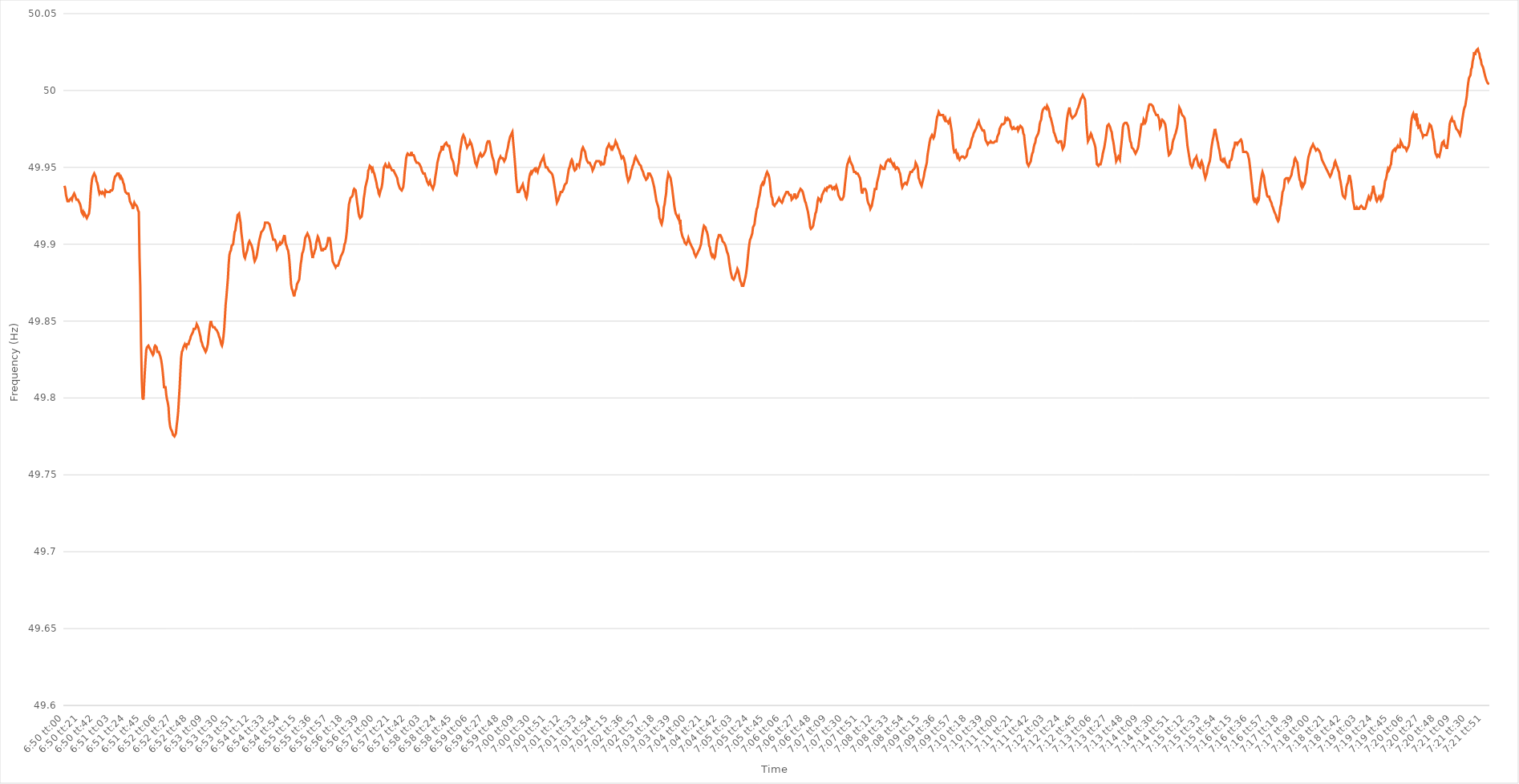
| Category | Series 0 |
|---|---|
| 0.2847222222222222 | 49.938 |
| 0.2847337962962963 | 49.936 |
| 0.28474537037037034 | 49.932 |
| 0.28475694444444444 | 49.93 |
| 0.28476851851851853 | 49.928 |
| 0.28478009259259257 | 49.928 |
| 0.28479166666666667 | 49.928 |
| 0.28480324074074076 | 49.929 |
| 0.2848148148148148 | 49.929 |
| 0.2848263888888889 | 49.93 |
| 0.284837962962963 | 49.929 |
| 0.284849537037037 | 49.931 |
| 0.2848611111111111 | 49.932 |
| 0.2848726851851852 | 49.933 |
| 0.28488425925925925 | 49.932 |
| 0.28489583333333335 | 49.932 |
| 0.2849074074074074 | 49.929 |
| 0.2849189814814815 | 49.929 |
| 0.2849305555555555 | 49.929 |
| 0.28494212962962967 | 49.929 |
| 0.2849537037037037 | 49.927 |
| 0.28496527777777775 | 49.926 |
| 0.28497685185185184 | 49.924 |
| 0.28498842592592594 | 49.921 |
| 0.285 | 49.92 |
| 0.28501157407407407 | 49.921 |
| 0.28502314814814816 | 49.919 |
| 0.2850347222222222 | 49.92 |
| 0.2850462962962963 | 49.919 |
| 0.2850578703703704 | 49.919 |
| 0.28506944444444443 | 49.917 |
| 0.2850810185185185 | 49.918 |
| 0.2850925925925926 | 49.918 |
| 0.28510416666666666 | 49.92 |
| 0.28511574074074075 | 49.924 |
| 0.28512731481481485 | 49.932 |
| 0.2851388888888889 | 49.938 |
| 0.2851504629629629 | 49.942 |
| 0.2851620370370371 | 49.944 |
| 0.2851736111111111 | 49.945 |
| 0.28518518518518515 | 49.946 |
| 0.28519675925925925 | 49.946 |
| 0.28520833333333334 | 49.944 |
| 0.2852199074074074 | 49.941 |
| 0.2852314814814815 | 49.94 |
| 0.28524305555555557 | 49.938 |
| 0.2852546296296296 | 49.935 |
| 0.2852662037037037 | 49.933 |
| 0.2852777777777778 | 49.934 |
| 0.28528935185185184 | 49.934 |
| 0.28530092592592593 | 49.933 |
| 0.2853125 | 49.934 |
| 0.28532407407407406 | 49.934 |
| 0.28533564814814816 | 49.933 |
| 0.28534722222222225 | 49.932 |
| 0.2853587962962963 | 49.935 |
| 0.28537037037037033 | 49.935 |
| 0.2853819444444445 | 49.934 |
| 0.2853935185185185 | 49.934 |
| 0.2854050925925926 | 49.934 |
| 0.28541666666666665 | 49.934 |
| 0.28542824074074075 | 49.934 |
| 0.2854398148148148 | 49.935 |
| 0.2854513888888889 | 49.935 |
| 0.285462962962963 | 49.935 |
| 0.285474537037037 | 49.936 |
| 0.2854861111111111 | 49.94 |
| 0.2854976851851852 | 49.942 |
| 0.28550925925925924 | 49.944 |
| 0.28552083333333333 | 49.944 |
| 0.28553240740740743 | 49.945 |
| 0.28554398148148147 | 49.946 |
| 0.28555555555555556 | 49.946 |
| 0.28556712962962966 | 49.946 |
| 0.2855787037037037 | 49.944 |
| 0.2855902777777778 | 49.943 |
| 0.2856018518518519 | 49.944 |
| 0.2856134259259259 | 49.943 |
| 0.285625 | 49.942 |
| 0.28563657407407406 | 49.94 |
| 0.28564814814814815 | 49.939 |
| 0.2856597222222222 | 49.936 |
| 0.2856712962962963 | 49.934 |
| 0.2856828703703704 | 49.934 |
| 0.2856944444444444 | 49.933 |
| 0.2857060185185185 | 49.933 |
| 0.2857175925925926 | 49.933 |
| 0.28572916666666665 | 49.931 |
| 0.28574074074074074 | 49.928 |
| 0.28575231481481483 | 49.928 |
| 0.2857638888888889 | 49.926 |
| 0.28577546296296297 | 49.925 |
| 0.28578703703703706 | 49.923 |
| 0.2857986111111111 | 49.925 |
| 0.2858101851851852 | 49.927 |
| 0.2858217592592593 | 49.926 |
| 0.28583333333333333 | 49.926 |
| 0.2858449074074074 | 49.925 |
| 0.28585648148148146 | 49.924 |
| 0.28586805555555556 | 49.922 |
| 0.2858796296296296 | 49.921 |
| 0.2858912037037037 | 49.891 |
| 0.2859027777777778 | 49.873 |
| 0.2859143518518518 | 49.837 |
| 0.2859259259259259 | 49.812 |
| 0.2859375 | 49.8 |
| 0.28594907407407405 | 49.799 |
| 0.28596064814814814 | 49.807 |
| 0.28597222222222224 | 49.816 |
| 0.2859837962962963 | 49.824 |
| 0.28599537037037037 | 49.831 |
| 0.28600694444444447 | 49.833 |
| 0.2860185185185185 | 49.833 |
| 0.2860300925925926 | 49.834 |
| 0.2860416666666667 | 49.833 |
| 0.28605324074074073 | 49.832 |
| 0.2860648148148148 | 49.831 |
| 0.2860763888888889 | 49.83 |
| 0.28608796296296296 | 49.829 |
| 0.286099537037037 | 49.828 |
| 0.28611111111111115 | 49.829 |
| 0.2861226851851852 | 49.833 |
| 0.2861342592592592 | 49.834 |
| 0.2861458333333333 | 49.834 |
| 0.2861574074074074 | 49.833 |
| 0.28616898148148145 | 49.83 |
| 0.28618055555555555 | 49.83 |
| 0.28619212962962964 | 49.83 |
| 0.2862037037037037 | 49.83 |
| 0.2862152777777778 | 49.827 |
| 0.28622685185185187 | 49.825 |
| 0.2862384259259259 | 49.822 |
| 0.28625 | 49.818 |
| 0.2862615740740741 | 49.813 |
| 0.28627314814814814 | 49.807 |
| 0.28628472222222223 | 49.807 |
| 0.2862962962962963 | 49.807 |
| 0.28630787037037037 | 49.802 |
| 0.2863194444444444 | 49.799 |
| 0.28633101851851855 | 49.797 |
| 0.2863425925925926 | 49.794 |
| 0.2863541666666667 | 49.786 |
| 0.2863657407407407 | 49.782 |
| 0.2863773148148148 | 49.78 |
| 0.28638888888888886 | 49.779 |
| 0.28640046296296295 | 49.778 |
| 0.28641203703703705 | 49.776 |
| 0.2864236111111111 | 49.776 |
| 0.2864351851851852 | 49.775 |
| 0.2864467592592593 | 49.776 |
| 0.2864583333333333 | 49.777 |
| 0.2864699074074074 | 49.782 |
| 0.2864814814814815 | 49.786 |
| 0.28649305555555554 | 49.791 |
| 0.28650462962962964 | 49.799 |
| 0.28651620370370373 | 49.807 |
| 0.28652777777777777 | 49.817 |
| 0.28653935185185186 | 49.826 |
| 0.28655092592592596 | 49.83 |
| 0.2865625 | 49.831 |
| 0.2865740740740741 | 49.833 |
| 0.28658564814814813 | 49.834 |
| 0.2865972222222222 | 49.835 |
| 0.28660879629629626 | 49.834 |
| 0.28662037037037036 | 49.833 |
| 0.28663194444444445 | 49.835 |
| 0.2866435185185185 | 49.835 |
| 0.2866550925925926 | 49.835 |
| 0.2866666666666667 | 49.837 |
| 0.2866782407407407 | 49.838 |
| 0.2866898148148148 | 49.84 |
| 0.2867013888888889 | 49.841 |
| 0.28671296296296295 | 49.842 |
| 0.28672453703703704 | 49.843 |
| 0.28673611111111114 | 49.845 |
| 0.2867476851851852 | 49.845 |
| 0.28675925925925927 | 49.845 |
| 0.28677083333333336 | 49.846 |
| 0.2867824074074074 | 49.848 |
| 0.2867939814814815 | 49.848 |
| 0.28680555555555554 | 49.846 |
| 0.28681712962962963 | 49.844 |
| 0.28682870370370367 | 49.844 |
| 0.28684027777777776 | 49.84 |
| 0.28685185185185186 | 49.837 |
| 0.2868634259259259 | 49.836 |
| 0.286875 | 49.834 |
| 0.2868865740740741 | 49.834 |
| 0.2868981481481481 | 49.832 |
| 0.2869097222222222 | 49.831 |
| 0.2869212962962963 | 49.83 |
| 0.28693287037037035 | 49.831 |
| 0.28694444444444445 | 49.833 |
| 0.28695601851851854 | 49.835 |
| 0.2869675925925926 | 49.84 |
| 0.2869791666666667 | 49.844 |
| 0.28699074074074077 | 49.848 |
| 0.2870023148148148 | 49.85 |
| 0.2870138888888889 | 49.848 |
| 0.287025462962963 | 49.847 |
| 0.28703703703703703 | 49.846 |
| 0.2870486111111111 | 49.846 |
| 0.2870601851851852 | 49.846 |
| 0.28707175925925926 | 49.845 |
| 0.2870833333333333 | 49.845 |
| 0.2870949074074074 | 49.844 |
| 0.2871064814814815 | 49.843 |
| 0.28711805555555553 | 49.842 |
| 0.2871296296296296 | 49.84 |
| 0.2871412037037037 | 49.839 |
| 0.28715277777777776 | 49.837 |
| 0.28716435185185185 | 49.835 |
| 0.28717592592592595 | 49.834 |
| 0.2871875 | 49.836 |
| 0.2871990740740741 | 49.84 |
| 0.2872106481481482 | 49.845 |
| 0.2872222222222222 | 49.853 |
| 0.2872337962962963 | 49.861 |
| 0.2872453703703704 | 49.866 |
| 0.28725694444444444 | 49.872 |
| 0.2872685185185185 | 49.878 |
| 0.28728009259259263 | 49.887 |
| 0.28729166666666667 | 49.893 |
| 0.28730324074074076 | 49.895 |
| 0.2873148148148148 | 49.896 |
| 0.2873263888888889 | 49.899 |
| 0.28733796296296293 | 49.899 |
| 0.28734953703703703 | 49.9 |
| 0.2873611111111111 | 49.904 |
| 0.28737268518518516 | 49.908 |
| 0.28738425925925926 | 49.909 |
| 0.28739583333333335 | 49.913 |
| 0.2874074074074074 | 49.915 |
| 0.2874189814814815 | 49.919 |
| 0.2874305555555556 | 49.919 |
| 0.2874421296296296 | 49.92 |
| 0.2874537037037037 | 49.917 |
| 0.2874652777777778 | 49.914 |
| 0.28747685185185184 | 49.908 |
| 0.28748842592592594 | 49.904 |
| 0.28750000000000003 | 49.9 |
| 0.28751157407407407 | 49.895 |
| 0.28752314814814817 | 49.892 |
| 0.2875347222222222 | 49.891 |
| 0.2875462962962963 | 49.893 |
| 0.28755787037037034 | 49.893 |
| 0.28756944444444443 | 49.896 |
| 0.2875810185185185 | 49.899 |
| 0.28759259259259257 | 49.901 |
| 0.28760416666666666 | 49.902 |
| 0.28761574074074076 | 49.902 |
| 0.2876273148148148 | 49.9 |
| 0.2876388888888889 | 49.899 |
| 0.287650462962963 | 49.897 |
| 0.287662037037037 | 49.895 |
| 0.2876736111111111 | 49.891 |
| 0.2876851851851852 | 49.889 |
| 0.28769675925925925 | 49.889 |
| 0.28770833333333334 | 49.891 |
| 0.28771990740740744 | 49.893 |
| 0.2877314814814815 | 49.896 |
| 0.28774305555555557 | 49.899 |
| 0.2877546296296296 | 49.902 |
| 0.2877662037037037 | 49.904 |
| 0.28777777777777774 | 49.906 |
| 0.28778935185185184 | 49.908 |
| 0.28780092592592593 | 49.908 |
| 0.28781249999999997 | 49.909 |
| 0.28782407407407407 | 49.91 |
| 0.28783564814814816 | 49.911 |
| 0.2878472222222222 | 49.914 |
| 0.2878587962962963 | 49.914 |
| 0.2878703703703704 | 49.914 |
| 0.2878819444444444 | 49.914 |
| 0.2878935185185185 | 49.914 |
| 0.2879050925925926 | 49.914 |
| 0.28791666666666665 | 49.913 |
| 0.28792824074074075 | 49.911 |
| 0.28793981481481484 | 49.909 |
| 0.2879513888888889 | 49.907 |
| 0.287962962962963 | 49.905 |
| 0.287974537037037 | 49.903 |
| 0.2879861111111111 | 49.903 |
| 0.28799768518518515 | 49.903 |
| 0.2880092592592593 | 49.902 |
| 0.28802083333333334 | 49.9 |
| 0.2880324074074074 | 49.897 |
| 0.28804398148148147 | 49.897 |
| 0.28805555555555556 | 49.899 |
| 0.2880671296296296 | 49.9 |
| 0.2880787037037037 | 49.901 |
| 0.2880902777777778 | 49.9 |
| 0.28810185185185183 | 49.9 |
| 0.2881134259259259 | 49.901 |
| 0.288125 | 49.903 |
| 0.28813657407407406 | 49.903 |
| 0.28814814814814815 | 49.906 |
| 0.28815972222222225 | 49.903 |
| 0.2881712962962963 | 49.9 |
| 0.2881828703703704 | 49.899 |
| 0.2881944444444445 | 49.897 |
| 0.2882060185185185 | 49.896 |
| 0.28821759259259255 | 49.893 |
| 0.2882291666666667 | 49.888 |
| 0.28824074074074074 | 49.881 |
| 0.28825231481481484 | 49.874 |
| 0.2882638888888889 | 49.871 |
| 0.28827546296296297 | 49.87 |
| 0.288287037037037 | 49.868 |
| 0.2882986111111111 | 49.866 |
| 0.2883101851851852 | 49.868 |
| 0.28832175925925924 | 49.87 |
| 0.28833333333333333 | 49.871 |
| 0.2883449074074074 | 49.874 |
| 0.28835648148148146 | 49.875 |
| 0.28836805555555556 | 49.875 |
| 0.28837962962962965 | 49.877 |
| 0.2883912037037037 | 49.882 |
| 0.2884027777777778 | 49.887 |
| 0.2884143518518519 | 49.89 |
| 0.2884259259259259 | 49.894 |
| 0.2884375 | 49.895 |
| 0.2884490740740741 | 49.897 |
| 0.28846064814814815 | 49.9 |
| 0.28847222222222224 | 49.904 |
| 0.2884837962962963 | 49.905 |
| 0.2884953703703704 | 49.906 |
| 0.2885069444444444 | 49.907 |
| 0.2885185185185185 | 49.906 |
| 0.2885300925925926 | 49.905 |
| 0.28854166666666664 | 49.903 |
| 0.28855324074074074 | 49.901 |
| 0.28856481481481483 | 49.897 |
| 0.28857638888888887 | 49.894 |
| 0.28858796296296296 | 49.891 |
| 0.28859953703703706 | 49.893 |
| 0.2886111111111111 | 49.894 |
| 0.2886226851851852 | 49.896 |
| 0.2886342592592593 | 49.897 |
| 0.2886458333333333 | 49.901 |
| 0.2886574074074074 | 49.903 |
| 0.2886689814814815 | 49.905 |
| 0.28868055555555555 | 49.904 |
| 0.28869212962962965 | 49.902 |
| 0.2887037037037037 | 49.9 |
| 0.2887152777777778 | 49.898 |
| 0.2887268518518518 | 49.896 |
| 0.2887384259259259 | 49.896 |
| 0.28875 | 49.896 |
| 0.28876157407407405 | 49.897 |
| 0.28877314814814814 | 49.897 |
| 0.28878472222222223 | 49.897 |
| 0.2887962962962963 | 49.897 |
| 0.28880787037037037 | 49.899 |
| 0.28881944444444446 | 49.901 |
| 0.2888310185185185 | 49.904 |
| 0.2888425925925926 | 49.904 |
| 0.2888541666666667 | 49.904 |
| 0.28886574074074073 | 49.902 |
| 0.2888773148148148 | 49.897 |
| 0.2888888888888889 | 49.894 |
| 0.28890046296296296 | 49.889 |
| 0.28891203703703705 | 49.888 |
| 0.2889236111111111 | 49.888 |
| 0.2889351851851852 | 49.886 |
| 0.2889467592592592 | 49.885 |
| 0.2889583333333334 | 49.886 |
| 0.2889699074074074 | 49.886 |
| 0.28898148148148145 | 49.886 |
| 0.28899305555555554 | 49.887 |
| 0.28900462962962964 | 49.889 |
| 0.2890162037037037 | 49.89 |
| 0.2890277777777778 | 49.892 |
| 0.28903935185185187 | 49.893 |
| 0.2890509259259259 | 49.893 |
| 0.2890625 | 49.895 |
| 0.2890740740740741 | 49.897 |
| 0.28908564814814813 | 49.9 |
| 0.2890972222222222 | 49.901 |
| 0.2891087962962963 | 49.904 |
| 0.28912037037037036 | 49.908 |
| 0.28913194444444446 | 49.914 |
| 0.28914351851851855 | 49.921 |
| 0.2891550925925926 | 49.926 |
| 0.2891666666666666 | 49.926 |
| 0.2891782407407408 | 49.93 |
| 0.2891898148148148 | 49.93 |
| 0.2892013888888889 | 49.931 |
| 0.28921296296296295 | 49.932 |
| 0.28922453703703704 | 49.935 |
| 0.2892361111111111 | 49.936 |
| 0.2892476851851852 | 49.936 |
| 0.28925925925925927 | 49.935 |
| 0.2892708333333333 | 49.931 |
| 0.2892824074074074 | 49.927 |
| 0.2892939814814815 | 49.924 |
| 0.28930555555555554 | 49.92 |
| 0.28931712962962963 | 49.918 |
| 0.2893287037037037 | 49.917 |
| 0.28934027777777777 | 49.917 |
| 0.28935185185185186 | 49.918 |
| 0.28936342592592595 | 49.921 |
| 0.289375 | 49.925 |
| 0.2893865740740741 | 49.93 |
| 0.2893981481481482 | 49.933 |
| 0.2894097222222222 | 49.937 |
| 0.2894212962962963 | 49.939 |
| 0.28943287037037035 | 49.941 |
| 0.28944444444444445 | 49.943 |
| 0.2894560185185185 | 49.948 |
| 0.2894675925925926 | 49.949 |
| 0.2894791666666667 | 49.951 |
| 0.2894907407407407 | 49.951 |
| 0.2895023148148148 | 49.95 |
| 0.2895138888888889 | 49.948 |
| 0.28952546296296294 | 49.949 |
| 0.28953703703703704 | 49.947 |
| 0.28954861111111113 | 49.946 |
| 0.28956018518518517 | 49.944 |
| 0.28957175925925926 | 49.942 |
| 0.28958333333333336 | 49.94 |
| 0.2895949074074074 | 49.937 |
| 0.2896064814814815 | 49.936 |
| 0.2896180555555556 | 49.933 |
| 0.2896296296296296 | 49.932 |
| 0.2896412037037037 | 49.934 |
| 0.28965277777777776 | 49.934 |
| 0.28966435185185185 | 49.937 |
| 0.2896759259259259 | 49.94 |
| 0.2896875 | 49.945 |
| 0.2896990740740741 | 49.95 |
| 0.2897106481481481 | 49.951 |
| 0.2897222222222222 | 49.952 |
| 0.2897337962962963 | 49.952 |
| 0.28974537037037035 | 49.95 |
| 0.28975694444444444 | 49.95 |
| 0.28976851851851854 | 49.95 |
| 0.2897800925925926 | 49.952 |
| 0.28979166666666667 | 49.952 |
| 0.28980324074074076 | 49.95 |
| 0.2898148148148148 | 49.95 |
| 0.2898263888888889 | 49.948 |
| 0.289837962962963 | 49.948 |
| 0.28984953703703703 | 49.948 |
| 0.2898611111111111 | 49.947 |
| 0.28987268518518516 | 49.947 |
| 0.28988425925925926 | 49.945 |
| 0.2898958333333333 | 49.944 |
| 0.28990740740740745 | 49.943 |
| 0.2899189814814815 | 49.94 |
| 0.2899305555555555 | 49.94 |
| 0.2899421296296296 | 49.937 |
| 0.2899537037037037 | 49.936 |
| 0.28996527777777775 | 49.936 |
| 0.28997685185185185 | 49.935 |
| 0.28998842592592594 | 49.936 |
| 0.29 | 49.937 |
| 0.2900115740740741 | 49.941 |
| 0.29002314814814817 | 49.947 |
| 0.2900347222222222 | 49.951 |
| 0.2900462962962963 | 49.956 |
| 0.2900578703703704 | 49.958 |
| 0.29006944444444444 | 49.959 |
| 0.29008101851851853 | 49.959 |
| 0.2900925925925926 | 49.958 |
| 0.29010416666666666 | 49.958 |
| 0.2901157407407407 | 49.958 |
| 0.29012731481481485 | 49.96 |
| 0.2901388888888889 | 49.958 |
| 0.290150462962963 | 49.958 |
| 0.290162037037037 | 49.958 |
| 0.2901736111111111 | 49.957 |
| 0.29018518518518516 | 49.955 |
| 0.29019675925925925 | 49.954 |
| 0.29020833333333335 | 49.953 |
| 0.2902199074074074 | 49.953 |
| 0.2902314814814815 | 49.953 |
| 0.2902430555555556 | 49.953 |
| 0.2902546296296296 | 49.952 |
| 0.2902662037037037 | 49.951 |
| 0.2902777777777778 | 49.95 |
| 0.29028935185185184 | 49.948 |
| 0.29030092592592593 | 49.947 |
| 0.29031250000000003 | 49.946 |
| 0.29032407407407407 | 49.946 |
| 0.29033564814814816 | 49.946 |
| 0.29034722222222226 | 49.944 |
| 0.2903587962962963 | 49.943 |
| 0.2903703703703704 | 49.941 |
| 0.29038194444444443 | 49.94 |
| 0.2903935185185185 | 49.939 |
| 0.29040509259259256 | 49.939 |
| 0.29041666666666666 | 49.941 |
| 0.29042824074074075 | 49.939 |
| 0.2904398148148148 | 49.938 |
| 0.2904513888888889 | 49.938 |
| 0.290462962962963 | 49.936 |
| 0.290474537037037 | 49.936 |
| 0.2904861111111111 | 49.939 |
| 0.2904976851851852 | 49.943 |
| 0.29050925925925924 | 49.946 |
| 0.29052083333333334 | 49.949 |
| 0.29053240740740743 | 49.953 |
| 0.2905439814814815 | 49.955 |
| 0.29055555555555557 | 49.957 |
| 0.29056712962962966 | 49.959 |
| 0.2905787037037037 | 49.96 |
| 0.2905902777777778 | 49.961 |
| 0.29060185185185183 | 49.964 |
| 0.29061342592592593 | 49.961 |
| 0.29062499999999997 | 49.963 |
| 0.29063657407407406 | 49.963 |
| 0.29064814814814816 | 49.965 |
| 0.2906597222222222 | 49.965 |
| 0.2906712962962963 | 49.966 |
| 0.2906828703703704 | 49.966 |
| 0.2906944444444444 | 49.964 |
| 0.2907060185185185 | 49.964 |
| 0.2907175925925926 | 49.964 |
| 0.29072916666666665 | 49.961 |
| 0.29074074074074074 | 49.959 |
| 0.29075231481481484 | 49.956 |
| 0.2907638888888889 | 49.955 |
| 0.29077546296296297 | 49.954 |
| 0.29078703703703707 | 49.952 |
| 0.2907986111111111 | 49.948 |
| 0.2908101851851852 | 49.946 |
| 0.29082175925925924 | 49.946 |
| 0.29083333333333333 | 49.945 |
| 0.29084490740740737 | 49.947 |
| 0.2908564814814815 | 49.951 |
| 0.29086805555555556 | 49.953 |
| 0.2908796296296296 | 49.959 |
| 0.2908912037037037 | 49.962 |
| 0.2909027777777778 | 49.965 |
| 0.2909143518518518 | 49.968 |
| 0.2909259259259259 | 49.97 |
| 0.2909375 | 49.971 |
| 0.29094907407407405 | 49.971 |
| 0.29096064814814815 | 49.969 |
| 0.29097222222222224 | 49.966 |
| 0.2909837962962963 | 49.965 |
| 0.2909953703703704 | 49.963 |
| 0.29100694444444447 | 49.964 |
| 0.2910185185185185 | 49.964 |
| 0.2910300925925926 | 49.965 |
| 0.2910416666666667 | 49.967 |
| 0.29105324074074074 | 49.967 |
| 0.2910648148148148 | 49.965 |
| 0.2910763888888889 | 49.963 |
| 0.29108796296296297 | 49.961 |
| 0.291099537037037 | 49.958 |
| 0.2911111111111111 | 49.956 |
| 0.2911226851851852 | 49.953 |
| 0.29113425925925923 | 49.952 |
| 0.2911458333333333 | 49.951 |
| 0.2911574074074074 | 49.953 |
| 0.29116898148148146 | 49.955 |
| 0.29118055555555555 | 49.957 |
| 0.29119212962962965 | 49.957 |
| 0.2912037037037037 | 49.959 |
| 0.2912152777777778 | 49.958 |
| 0.2912268518518519 | 49.957 |
| 0.2912384259259259 | 49.957 |
| 0.29125 | 49.958 |
| 0.2912615740740741 | 49.958 |
| 0.29127314814814814 | 49.96 |
| 0.29128472222222224 | 49.961 |
| 0.29129629629629633 | 49.964 |
| 0.29130787037037037 | 49.966 |
| 0.29131944444444446 | 49.967 |
| 0.2913310185185185 | 49.967 |
| 0.2913425925925926 | 49.967 |
| 0.29135416666666664 | 49.965 |
| 0.29136574074074073 | 49.962 |
| 0.2913773148148148 | 49.959 |
| 0.29138888888888886 | 49.957 |
| 0.29140046296296296 | 49.957 |
| 0.29141203703703705 | 49.954 |
| 0.2914236111111111 | 49.95 |
| 0.2914351851851852 | 49.947 |
| 0.2914467592592593 | 49.946 |
| 0.2914583333333333 | 49.947 |
| 0.2914699074074074 | 49.95 |
| 0.2914814814814815 | 49.953 |
| 0.29149305555555555 | 49.955 |
| 0.29150462962962964 | 49.956 |
| 0.29151620370370374 | 49.957 |
| 0.2915277777777778 | 49.956 |
| 0.29153935185185187 | 49.956 |
| 0.2915509259259259 | 49.956 |
| 0.2915625 | 49.955 |
| 0.29157407407407404 | 49.954 |
| 0.29158564814814814 | 49.954 |
| 0.29159722222222223 | 49.956 |
| 0.29160879629629627 | 49.959 |
| 0.29162037037037036 | 49.961 |
| 0.29163194444444446 | 49.963 |
| 0.2916435185185185 | 49.966 |
| 0.2916550925925926 | 49.968 |
| 0.2916666666666667 | 49.97 |
| 0.2916782407407407 | 49.971 |
| 0.2916898148148148 | 49.972 |
| 0.2917013888888889 | 49.973 |
| 0.29171296296296295 | 49.967 |
| 0.29172453703703705 | 49.962 |
| 0.29173611111111114 | 49.956 |
| 0.2917476851851852 | 49.95 |
| 0.2917592592592593 | 49.943 |
| 0.29177083333333337 | 49.938 |
| 0.2917824074074074 | 49.934 |
| 0.29179398148148145 | 49.934 |
| 0.29180555555555554 | 49.934 |
| 0.29181712962962963 | 49.934 |
| 0.2918287037037037 | 49.936 |
| 0.29184027777777777 | 49.937 |
| 0.29185185185185186 | 49.938 |
| 0.2918634259259259 | 49.939 |
| 0.291875 | 49.937 |
| 0.2918865740740741 | 49.935 |
| 0.29189814814814813 | 49.934 |
| 0.2919097222222222 | 49.931 |
| 0.2919212962962963 | 49.93 |
| 0.29193287037037036 | 49.932 |
| 0.29194444444444445 | 49.936 |
| 0.29195601851851855 | 49.941 |
| 0.2919675925925926 | 49.944 |
| 0.2919791666666667 | 49.946 |
| 0.2919907407407408 | 49.947 |
| 0.2920023148148148 | 49.946 |
| 0.2920138888888889 | 49.946 |
| 0.29202546296296295 | 49.948 |
| 0.29203703703703704 | 49.948 |
| 0.2920486111111111 | 49.949 |
| 0.2920601851851852 | 49.948 |
| 0.29207175925925927 | 49.949 |
| 0.2920833333333333 | 49.948 |
| 0.2920949074074074 | 49.947 |
| 0.2921064814814815 | 49.949 |
| 0.29211805555555553 | 49.95 |
| 0.29212962962962963 | 49.951 |
| 0.2921412037037037 | 49.953 |
| 0.29215277777777776 | 49.953 |
| 0.29216435185185186 | 49.955 |
| 0.29217592592592595 | 49.955 |
| 0.2921875 | 49.957 |
| 0.2921990740740741 | 49.954 |
| 0.2922106481481482 | 49.952 |
| 0.2922222222222222 | 49.95 |
| 0.2922337962962963 | 49.95 |
| 0.2922453703703704 | 49.95 |
| 0.29225694444444444 | 49.95 |
| 0.2922685185185185 | 49.948 |
| 0.2922800925925926 | 49.948 |
| 0.29229166666666667 | 49.947 |
| 0.2923032407407407 | 49.947 |
| 0.2923148148148148 | 49.946 |
| 0.2923263888888889 | 49.945 |
| 0.29233796296296294 | 49.943 |
| 0.29234953703703703 | 49.94 |
| 0.2923611111111111 | 49.937 |
| 0.29237268518518517 | 49.934 |
| 0.29238425925925926 | 49.93 |
| 0.29239583333333335 | 49.927 |
| 0.2924074074074074 | 49.927 |
| 0.2924189814814815 | 49.929 |
| 0.2924305555555556 | 49.931 |
| 0.2924421296296296 | 49.932 |
| 0.2924537037037037 | 49.934 |
| 0.2924652777777778 | 49.934 |
| 0.29247685185185185 | 49.934 |
| 0.29248842592592594 | 49.935 |
| 0.2925 | 49.936 |
| 0.2925115740740741 | 49.938 |
| 0.2925231481481481 | 49.939 |
| 0.2925347222222222 | 49.939 |
| 0.2925462962962963 | 49.94 |
| 0.29255787037037034 | 49.943 |
| 0.29256944444444444 | 49.946 |
| 0.29258101851851853 | 49.949 |
| 0.29259259259259257 | 49.95 |
| 0.29260416666666667 | 49.952 |
| 0.29261574074074076 | 49.954 |
| 0.2926273148148148 | 49.955 |
| 0.2926388888888889 | 49.954 |
| 0.292650462962963 | 49.951 |
| 0.292662037037037 | 49.949 |
| 0.2926736111111111 | 49.948 |
| 0.2926851851851852 | 49.948 |
| 0.29269675925925925 | 49.949 |
| 0.29270833333333335 | 49.952 |
| 0.29271990740740744 | 49.952 |
| 0.2927314814814815 | 49.952 |
| 0.2927430555555555 | 49.951 |
| 0.2927546296296296 | 49.954 |
| 0.2927662037037037 | 49.956 |
| 0.29277777777777775 | 49.96 |
| 0.29278935185185184 | 49.962 |
| 0.29280092592592594 | 49.963 |
| 0.2928125 | 49.963 |
| 0.29282407407407407 | 49.961 |
| 0.29283564814814816 | 49.96 |
| 0.2928472222222222 | 49.957 |
| 0.2928587962962963 | 49.955 |
| 0.2928703703703704 | 49.954 |
| 0.29288194444444443 | 49.953 |
| 0.2928935185185185 | 49.953 |
| 0.2929050925925926 | 49.953 |
| 0.29291666666666666 | 49.953 |
| 0.29292824074074075 | 49.951 |
| 0.29293981481481485 | 49.95 |
| 0.2929513888888889 | 49.948 |
| 0.292962962962963 | 49.948 |
| 0.292974537037037 | 49.95 |
| 0.2929861111111111 | 49.952 |
| 0.29299768518518515 | 49.953 |
| 0.29300925925925925 | 49.954 |
| 0.29302083333333334 | 49.954 |
| 0.2930324074074074 | 49.954 |
| 0.2930439814814815 | 49.954 |
| 0.29305555555555557 | 49.954 |
| 0.2930671296296296 | 49.953 |
| 0.2930787037037037 | 49.952 |
| 0.2930902777777778 | 49.953 |
| 0.29310185185185184 | 49.952 |
| 0.29311342592592593 | 49.952 |
| 0.293125 | 49.952 |
| 0.29313657407407406 | 49.953 |
| 0.29314814814814816 | 49.957 |
| 0.29315972222222225 | 49.958 |
| 0.2931712962962963 | 49.962 |
| 0.2931828703703704 | 49.963 |
| 0.2931944444444445 | 49.964 |
| 0.2932060185185185 | 49.965 |
| 0.29321759259259256 | 49.965 |
| 0.29322916666666665 | 49.963 |
| 0.29324074074074075 | 49.962 |
| 0.2932523148148148 | 49.963 |
| 0.2932638888888889 | 49.962 |
| 0.293275462962963 | 49.962 |
| 0.293287037037037 | 49.964 |
| 0.2932986111111111 | 49.965 |
| 0.2933101851851852 | 49.967 |
| 0.29332175925925924 | 49.966 |
| 0.29333333333333333 | 49.965 |
| 0.29334490740740743 | 49.963 |
| 0.29335648148148147 | 49.962 |
| 0.29336805555555556 | 49.961 |
| 0.29337962962962966 | 49.959 |
| 0.2933912037037037 | 49.958 |
| 0.2934027777777778 | 49.956 |
| 0.2934143518518519 | 49.956 |
| 0.2934259259259259 | 49.957 |
| 0.2934375 | 49.956 |
| 0.29344907407407406 | 49.954 |
| 0.29346064814814815 | 49.952 |
| 0.2934722222222222 | 49.948 |
| 0.2934837962962963 | 49.945 |
| 0.2934953703703704 | 49.943 |
| 0.2935069444444444 | 49.941 |
| 0.2935185185185185 | 49.942 |
| 0.2935300925925926 | 49.943 |
| 0.29354166666666665 | 49.945 |
| 0.29355324074074074 | 49.948 |
| 0.29356481481481483 | 49.949 |
| 0.2935763888888889 | 49.951 |
| 0.29358796296296297 | 49.952 |
| 0.29359953703703706 | 49.954 |
| 0.2936111111111111 | 49.956 |
| 0.2936226851851852 | 49.957 |
| 0.2936342592592593 | 49.957 |
| 0.29364583333333333 | 49.955 |
| 0.2936574074074074 | 49.954 |
| 0.2936689814814815 | 49.953 |
| 0.29368055555555556 | 49.952 |
| 0.2936921296296296 | 49.952 |
| 0.2937037037037037 | 49.951 |
| 0.2937152777777778 | 49.949 |
| 0.2937268518518518 | 49.948 |
| 0.2937384259259259 | 49.947 |
| 0.29375 | 49.945 |
| 0.29376157407407405 | 49.945 |
| 0.29377314814814814 | 49.943 |
| 0.29378472222222224 | 49.942 |
| 0.2937962962962963 | 49.942 |
| 0.29380787037037037 | 49.943 |
| 0.29381944444444447 | 49.946 |
| 0.2938310185185185 | 49.946 |
| 0.2938425925925926 | 49.946 |
| 0.2938541666666667 | 49.945 |
| 0.29386574074074073 | 49.945 |
| 0.2938773148148148 | 49.943 |
| 0.2938888888888889 | 49.941 |
| 0.29390046296296296 | 49.939 |
| 0.29391203703703705 | 49.937 |
| 0.2939236111111111 | 49.934 |
| 0.2939351851851852 | 49.931 |
| 0.2939467592592592 | 49.928 |
| 0.2939583333333333 | 49.928 |
| 0.2939699074074074 | 49.925 |
| 0.29398148148148145 | 49.923 |
| 0.29399305555555555 | 49.917 |
| 0.29400462962962964 | 49.916 |
| 0.2940162037037037 | 49.914 |
| 0.2940277777777778 | 49.913 |
| 0.29403935185185187 | 49.915 |
| 0.2940509259259259 | 49.918 |
| 0.2940625 | 49.924 |
| 0.2940740740740741 | 49.926 |
| 0.29408564814814814 | 49.93 |
| 0.29409722222222223 | 49.933 |
| 0.2941087962962963 | 49.94 |
| 0.29412037037037037 | 49.943 |
| 0.29413194444444446 | 49.946 |
| 0.29414351851851855 | 49.945 |
| 0.2941550925925926 | 49.945 |
| 0.29416666666666663 | 49.943 |
| 0.2941782407407407 | 49.94 |
| 0.2941898148148148 | 49.937 |
| 0.29420138888888886 | 49.933 |
| 0.29421296296296295 | 49.929 |
| 0.29422453703703705 | 49.925 |
| 0.2942361111111111 | 49.922 |
| 0.2942476851851852 | 49.92 |
| 0.2942592592592593 | 49.919 |
| 0.2942708333333333 | 49.919 |
| 0.2942824074074074 | 49.917 |
| 0.2942939814814815 | 49.918 |
| 0.29430555555555554 | 49.915 |
| 0.29431712962962964 | 49.916 |
| 0.29432870370370373 | 49.909 |
| 0.29434027777777777 | 49.907 |
| 0.29435185185185186 | 49.905 |
| 0.29436342592592596 | 49.904 |
| 0.294375 | 49.903 |
| 0.2943865740740741 | 49.901 |
| 0.29439814814814813 | 49.901 |
| 0.2944097222222222 | 49.9 |
| 0.29442129629629626 | 49.901 |
| 0.29443287037037036 | 49.902 |
| 0.29444444444444445 | 49.904 |
| 0.2944560185185185 | 49.904 |
| 0.2944675925925926 | 49.901 |
| 0.2944791666666667 | 49.9 |
| 0.2944907407407407 | 49.899 |
| 0.2945023148148148 | 49.898 |
| 0.2945138888888889 | 49.897 |
| 0.29452546296296295 | 49.896 |
| 0.29453703703703704 | 49.894 |
| 0.29454861111111114 | 49.893 |
| 0.2945601851851852 | 49.892 |
| 0.29457175925925927 | 49.893 |
| 0.29458333333333336 | 49.894 |
| 0.2945949074074074 | 49.895 |
| 0.2946064814814815 | 49.896 |
| 0.2946180555555556 | 49.897 |
| 0.29462962962962963 | 49.897 |
| 0.29464120370370367 | 49.9 |
| 0.29465277777777776 | 49.904 |
| 0.29466435185185186 | 49.907 |
| 0.2946759259259259 | 49.91 |
| 0.2946875 | 49.912 |
| 0.2946990740740741 | 49.912 |
| 0.2947106481481481 | 49.911 |
| 0.2947222222222222 | 49.909 |
| 0.2947337962962963 | 49.908 |
| 0.29474537037037035 | 49.906 |
| 0.29475694444444445 | 49.903 |
| 0.29476851851851854 | 49.899 |
| 0.2947800925925926 | 49.898 |
| 0.2947916666666667 | 49.895 |
| 0.29480324074074077 | 49.893 |
| 0.2948148148148148 | 49.892 |
| 0.2948263888888889 | 49.893 |
| 0.294837962962963 | 49.892 |
| 0.29484953703703703 | 49.891 |
| 0.2948611111111111 | 49.892 |
| 0.29487268518518517 | 49.896 |
| 0.29488425925925926 | 49.9 |
| 0.2948958333333333 | 49.903 |
| 0.2949074074074074 | 49.904 |
| 0.2949189814814815 | 49.906 |
| 0.29493055555555553 | 49.906 |
| 0.2949421296296296 | 49.906 |
| 0.2949537037037037 | 49.905 |
| 0.29496527777777776 | 49.904 |
| 0.29497685185185185 | 49.902 |
| 0.29498842592592595 | 49.902 |
| 0.295 | 49.901 |
| 0.2950115740740741 | 49.9 |
| 0.2950231481481482 | 49.899 |
| 0.2950347222222222 | 49.897 |
| 0.2950462962962963 | 49.895 |
| 0.2950578703703704 | 49.894 |
| 0.29506944444444444 | 49.892 |
| 0.29508101851851853 | 49.888 |
| 0.29509259259259263 | 49.885 |
| 0.29510416666666667 | 49.882 |
| 0.2951157407407407 | 49.88 |
| 0.2951273148148148 | 49.878 |
| 0.2951388888888889 | 49.878 |
| 0.29515046296296293 | 49.877 |
| 0.29516203703703703 | 49.878 |
| 0.2951736111111111 | 49.878 |
| 0.29518518518518516 | 49.881 |
| 0.29519675925925926 | 49.882 |
| 0.29520833333333335 | 49.884 |
| 0.2952199074074074 | 49.883 |
| 0.2952314814814815 | 49.881 |
| 0.2952430555555556 | 49.878 |
| 0.2952546296296296 | 49.876 |
| 0.2952662037037037 | 49.875 |
| 0.2952777777777778 | 49.873 |
| 0.29528935185185184 | 49.873 |
| 0.29530092592592594 | 49.873 |
| 0.29531250000000003 | 49.875 |
| 0.29532407407407407 | 49.877 |
| 0.29533564814814817 | 49.879 |
| 0.2953472222222222 | 49.882 |
| 0.2953587962962963 | 49.886 |
| 0.29537037037037034 | 49.891 |
| 0.29538194444444443 | 49.896 |
| 0.2953935185185185 | 49.9 |
| 0.29540509259259257 | 49.903 |
| 0.29541666666666666 | 49.904 |
| 0.29542824074074076 | 49.904 |
| 0.2954398148148148 | 49.907 |
| 0.2954513888888889 | 49.911 |
| 0.295462962962963 | 49.912 |
| 0.295474537037037 | 49.913 |
| 0.2954861111111111 | 49.917 |
| 0.2954976851851852 | 49.92 |
| 0.29550925925925925 | 49.923 |
| 0.29552083333333334 | 49.924 |
| 0.29553240740740744 | 49.927 |
| 0.2955439814814815 | 49.93 |
| 0.29555555555555557 | 49.932 |
| 0.29556712962962967 | 49.935 |
| 0.2955787037037037 | 49.938 |
| 0.29559027777777774 | 49.938 |
| 0.29560185185185184 | 49.94 |
| 0.29561342592592593 | 49.939 |
| 0.29562499999999997 | 49.94 |
| 0.29563657407407407 | 49.943 |
| 0.29564814814814816 | 49.944 |
| 0.2956597222222222 | 49.946 |
| 0.2956712962962963 | 49.947 |
| 0.2956828703703704 | 49.946 |
| 0.2956944444444444 | 49.945 |
| 0.2957060185185185 | 49.943 |
| 0.2957175925925926 | 49.939 |
| 0.29572916666666665 | 49.934 |
| 0.29574074074074075 | 49.931 |
| 0.29575231481481484 | 49.93 |
| 0.2957638888888889 | 49.926 |
| 0.295775462962963 | 49.926 |
| 0.29578703703703707 | 49.925 |
| 0.2957986111111111 | 49.926 |
| 0.29581018518518515 | 49.926 |
| 0.29582175925925924 | 49.927 |
| 0.29583333333333334 | 49.928 |
| 0.2958449074074074 | 49.929 |
| 0.29585648148148147 | 49.93 |
| 0.29586805555555556 | 49.929 |
| 0.2958796296296296 | 49.928 |
| 0.2958912037037037 | 49.928 |
| 0.2959027777777778 | 49.927 |
| 0.29591435185185183 | 49.928 |
| 0.2959259259259259 | 49.93 |
| 0.2959375 | 49.931 |
| 0.29594907407407406 | 49.932 |
| 0.29596064814814815 | 49.933 |
| 0.29597222222222225 | 49.934 |
| 0.2959837962962963 | 49.934 |
| 0.2959953703703704 | 49.934 |
| 0.2960069444444445 | 49.934 |
| 0.2960185185185185 | 49.932 |
| 0.2960300925925926 | 49.932 |
| 0.2960416666666667 | 49.932 |
| 0.29605324074074074 | 49.929 |
| 0.2960648148148148 | 49.929 |
| 0.2960763888888889 | 49.93 |
| 0.29608796296296297 | 49.931 |
| 0.296099537037037 | 49.933 |
| 0.2961111111111111 | 49.931 |
| 0.2961226851851852 | 49.93 |
| 0.29613425925925924 | 49.93 |
| 0.29614583333333333 | 49.931 |
| 0.2961574074074074 | 49.933 |
| 0.29616898148148146 | 49.933 |
| 0.29618055555555556 | 49.935 |
| 0.29619212962962965 | 49.936 |
| 0.2962037037037037 | 49.936 |
| 0.2962152777777778 | 49.935 |
| 0.2962268518518519 | 49.934 |
| 0.2962384259259259 | 49.932 |
| 0.29625 | 49.93 |
| 0.2962615740740741 | 49.928 |
| 0.29627314814814815 | 49.927 |
| 0.29628472222222224 | 49.925 |
| 0.2962962962962963 | 49.925 |
| 0.2963078703703704 | 49.921 |
| 0.2963194444444444 | 49.918 |
| 0.2963310185185185 | 49.915 |
| 0.2963425925925926 | 49.911 |
| 0.29635416666666664 | 49.91 |
| 0.29636574074074074 | 49.91 |
| 0.29637731481481483 | 49.911 |
| 0.29638888888888887 | 49.912 |
| 0.29640046296296296 | 49.915 |
| 0.29641203703703706 | 49.917 |
| 0.2964236111111111 | 49.92 |
| 0.2964351851851852 | 49.921 |
| 0.2964467592592593 | 49.924 |
| 0.2964583333333333 | 49.928 |
| 0.2964699074074074 | 49.93 |
| 0.2964814814814815 | 49.93 |
| 0.29649305555555555 | 49.929 |
| 0.29650462962962965 | 49.928 |
| 0.29651620370370374 | 49.929 |
| 0.2965277777777778 | 49.932 |
| 0.2965393518518518 | 49.933 |
| 0.2965509259259259 | 49.933 |
| 0.2965625 | 49.935 |
| 0.29657407407407405 | 49.936 |
| 0.29658564814814814 | 49.936 |
| 0.29659722222222223 | 49.935 |
| 0.2966087962962963 | 49.937 |
| 0.29662037037037037 | 49.937 |
| 0.29663194444444446 | 49.937 |
| 0.2966435185185185 | 49.938 |
| 0.2966550925925926 | 49.938 |
| 0.2966666666666667 | 49.938 |
| 0.29667824074074073 | 49.937 |
| 0.2966898148148148 | 49.936 |
| 0.2967013888888889 | 49.936 |
| 0.29671296296296296 | 49.937 |
| 0.29672453703703705 | 49.936 |
| 0.29673611111111114 | 49.936 |
| 0.2967476851851852 | 49.938 |
| 0.2967592592592592 | 49.938 |
| 0.2967708333333333 | 49.935 |
| 0.2967824074074074 | 49.932 |
| 0.29679398148148145 | 49.931 |
| 0.29680555555555554 | 49.93 |
| 0.29681712962962964 | 49.929 |
| 0.2968287037037037 | 49.929 |
| 0.2968402777777778 | 49.929 |
| 0.29685185185185187 | 49.93 |
| 0.2968634259259259 | 49.931 |
| 0.296875 | 49.935 |
| 0.2968865740740741 | 49.94 |
| 0.29689814814814813 | 49.944 |
| 0.2969097222222222 | 49.949 |
| 0.2969212962962963 | 49.952 |
| 0.29693287037037036 | 49.953 |
| 0.29694444444444446 | 49.955 |
| 0.29695601851851855 | 49.956 |
| 0.2969675925925926 | 49.954 |
| 0.2969791666666667 | 49.953 |
| 0.2969907407407408 | 49.952 |
| 0.2970023148148148 | 49.951 |
| 0.29701388888888886 | 49.949 |
| 0.29702546296296295 | 49.947 |
| 0.29703703703703704 | 49.947 |
| 0.2970486111111111 | 49.947 |
| 0.2970601851851852 | 49.946 |
| 0.29707175925925927 | 49.946 |
| 0.2970833333333333 | 49.946 |
| 0.2970949074074074 | 49.946 |
| 0.2971064814814815 | 49.944 |
| 0.29711805555555554 | 49.943 |
| 0.29712962962962963 | 49.94 |
| 0.2971412037037037 | 49.935 |
| 0.29715277777777777 | 49.933 |
| 0.29716435185185186 | 49.935 |
| 0.29717592592592595 | 49.936 |
| 0.2971875 | 49.936 |
| 0.2971990740740741 | 49.936 |
| 0.2972106481481482 | 49.935 |
| 0.2972222222222222 | 49.933 |
| 0.2972337962962963 | 49.929 |
| 0.29724537037037035 | 49.927 |
| 0.29725694444444445 | 49.927 |
| 0.2972685185185185 | 49.925 |
| 0.2972800925925926 | 49.923 |
| 0.2972916666666667 | 49.924 |
| 0.2973032407407407 | 49.925 |
| 0.2973148148148148 | 49.928 |
| 0.2973263888888889 | 49.93 |
| 0.29733796296296294 | 49.933 |
| 0.29734953703703704 | 49.936 |
| 0.29736111111111113 | 49.936 |
| 0.29737268518518517 | 49.936 |
| 0.29738425925925926 | 49.94 |
| 0.29739583333333336 | 49.942 |
| 0.2974074074074074 | 49.944 |
| 0.2974189814814815 | 49.946 |
| 0.2974305555555556 | 49.949 |
| 0.2974421296296296 | 49.951 |
| 0.2974537037037037 | 49.951 |
| 0.29746527777777776 | 49.95 |
| 0.29747685185185185 | 49.949 |
| 0.2974884259259259 | 49.949 |
| 0.2975 | 49.949 |
| 0.2975115740740741 | 49.951 |
| 0.2975231481481481 | 49.953 |
| 0.2975347222222222 | 49.954 |
| 0.2975462962962963 | 49.954 |
| 0.29755787037037035 | 49.955 |
| 0.29756944444444444 | 49.955 |
| 0.29758101851851854 | 49.954 |
| 0.2975925925925926 | 49.955 |
| 0.29760416666666667 | 49.954 |
| 0.29761574074074076 | 49.953 |
| 0.2976273148148148 | 49.952 |
| 0.2976388888888889 | 49.951 |
| 0.297650462962963 | 49.952 |
| 0.29766203703703703 | 49.952 |
| 0.2976736111111111 | 49.949 |
| 0.2976851851851852 | 49.949 |
| 0.29769675925925926 | 49.95 |
| 0.2977083333333333 | 49.95 |
| 0.2977199074074074 | 49.949 |
| 0.2977314814814815 | 49.947 |
| 0.2977430555555555 | 49.946 |
| 0.2977546296296296 | 49.943 |
| 0.2977662037037037 | 49.939 |
| 0.29777777777777775 | 49.937 |
| 0.29778935185185185 | 49.937 |
| 0.29780092592592594 | 49.939 |
| 0.2978125 | 49.939 |
| 0.2978240740740741 | 49.94 |
| 0.29783564814814817 | 49.94 |
| 0.2978472222222222 | 49.939 |
| 0.2978587962962963 | 49.939 |
| 0.2978703703703704 | 49.942 |
| 0.29788194444444444 | 49.944 |
| 0.29789351851851853 | 49.944 |
| 0.2979050925925926 | 49.947 |
| 0.29791666666666666 | 49.947 |
| 0.29792824074074076 | 49.947 |
| 0.29793981481481485 | 49.948 |
| 0.2979513888888889 | 49.948 |
| 0.29796296296296293 | 49.949 |
| 0.297974537037037 | 49.95 |
| 0.2979861111111111 | 49.953 |
| 0.29799768518518516 | 49.953 |
| 0.29800925925925925 | 49.951 |
| 0.29802083333333335 | 49.949 |
| 0.2980324074074074 | 49.943 |
| 0.2980439814814815 | 49.942 |
| 0.2980555555555556 | 49.94 |
| 0.2980671296296296 | 49.94 |
| 0.2980787037037037 | 49.938 |
| 0.2980902777777778 | 49.94 |
| 0.29810185185185184 | 49.942 |
| 0.29811342592592593 | 49.944 |
| 0.29812500000000003 | 49.947 |
| 0.29813657407407407 | 49.949 |
| 0.29814814814814816 | 49.951 |
| 0.29815972222222226 | 49.953 |
| 0.2981712962962963 | 49.958 |
| 0.29818287037037033 | 49.961 |
| 0.29819444444444443 | 49.964 |
| 0.2982060185185185 | 49.967 |
| 0.29821759259259256 | 49.969 |
| 0.29822916666666666 | 49.969 |
| 0.29824074074074075 | 49.971 |
| 0.2982523148148148 | 49.97 |
| 0.2982638888888889 | 49.969 |
| 0.298275462962963 | 49.97 |
| 0.298287037037037 | 49.973 |
| 0.2982986111111111 | 49.976 |
| 0.2983101851851852 | 49.98 |
| 0.29832175925925924 | 49.983 |
| 0.29833333333333334 | 49.984 |
| 0.29834490740740743 | 49.986 |
| 0.2983564814814815 | 49.986 |
| 0.29836805555555557 | 49.984 |
| 0.29837962962962966 | 49.984 |
| 0.2983912037037037 | 49.984 |
| 0.2984027777777778 | 49.984 |
| 0.29841435185185183 | 49.984 |
| 0.29842592592592593 | 49.982 |
| 0.29843749999999997 | 49.981 |
| 0.29844907407407406 | 49.982 |
| 0.29846064814814816 | 49.98 |
| 0.2984722222222222 | 49.98 |
| 0.2984837962962963 | 49.98 |
| 0.2984953703703704 | 49.979 |
| 0.2985069444444444 | 49.98 |
| 0.2985185185185185 | 49.981 |
| 0.2985300925925926 | 49.978 |
| 0.29854166666666665 | 49.975 |
| 0.29855324074074074 | 49.972 |
| 0.29856481481481484 | 49.966 |
| 0.2985763888888889 | 49.962 |
| 0.29858796296296297 | 49.96 |
| 0.29859953703703707 | 49.96 |
| 0.2986111111111111 | 49.961 |
| 0.2986226851851852 | 49.959 |
| 0.2986342592592593 | 49.957 |
| 0.29864583333333333 | 49.958 |
| 0.29865740740740737 | 49.956 |
| 0.29866898148148147 | 49.955 |
| 0.29868055555555556 | 49.956 |
| 0.2986921296296296 | 49.956 |
| 0.2987037037037037 | 49.957 |
| 0.2987152777777778 | 49.957 |
| 0.2987268518518518 | 49.957 |
| 0.2987384259259259 | 49.957 |
| 0.29875 | 49.956 |
| 0.29876157407407405 | 49.956 |
| 0.29877314814814815 | 49.957 |
| 0.29878472222222224 | 49.958 |
| 0.2987962962962963 | 49.961 |
| 0.2988078703703704 | 49.962 |
| 0.29881944444444447 | 49.962 |
| 0.2988310185185185 | 49.963 |
| 0.2988425925925926 | 49.965 |
| 0.2988541666666667 | 49.967 |
| 0.29886574074074074 | 49.969 |
| 0.29887731481481483 | 49.97 |
| 0.2988888888888889 | 49.972 |
| 0.29890046296296297 | 49.973 |
| 0.298912037037037 | 49.974 |
| 0.2989236111111111 | 49.975 |
| 0.2989351851851852 | 49.976 |
| 0.29894675925925923 | 49.978 |
| 0.2989583333333333 | 49.979 |
| 0.2989699074074074 | 49.98 |
| 0.29898148148148146 | 49.978 |
| 0.29899305555555555 | 49.977 |
| 0.29900462962962965 | 49.976 |
| 0.2990162037037037 | 49.975 |
| 0.2990277777777778 | 49.974 |
| 0.2990393518518519 | 49.974 |
| 0.2990509259259259 | 49.974 |
| 0.2990625 | 49.972 |
| 0.2990740740740741 | 49.968 |
| 0.29908564814814814 | 49.967 |
| 0.29909722222222224 | 49.966 |
| 0.29910879629629633 | 49.965 |
| 0.29912037037037037 | 49.966 |
| 0.2991319444444444 | 49.966 |
| 0.2991435185185185 | 49.966 |
| 0.2991550925925926 | 49.967 |
| 0.29916666666666664 | 49.967 |
| 0.29917824074074073 | 49.966 |
| 0.2991898148148148 | 49.966 |
| 0.29920138888888886 | 49.966 |
| 0.29921296296296296 | 49.966 |
| 0.29922453703703705 | 49.967 |
| 0.2992361111111111 | 49.967 |
| 0.2992476851851852 | 49.967 |
| 0.2992592592592593 | 49.97 |
| 0.2992708333333333 | 49.971 |
| 0.2992824074074074 | 49.972 |
| 0.2992939814814815 | 49.975 |
| 0.29930555555555555 | 49.976 |
| 0.29931712962962964 | 49.977 |
| 0.29932870370370374 | 49.978 |
| 0.2993402777777778 | 49.978 |
| 0.29935185185185187 | 49.978 |
| 0.2993634259259259 | 49.978 |
| 0.299375 | 49.979 |
| 0.29938657407407404 | 49.982 |
| 0.29939814814814814 | 49.982 |
| 0.29940972222222223 | 49.981 |
| 0.29942129629629627 | 49.982 |
| 0.29943287037037036 | 49.982 |
| 0.29944444444444446 | 49.981 |
| 0.2994560185185185 | 49.98 |
| 0.2994675925925926 | 49.977 |
| 0.2994791666666667 | 49.976 |
| 0.2994907407407407 | 49.975 |
| 0.2995023148148148 | 49.975 |
| 0.2995138888888889 | 49.976 |
| 0.29952546296296295 | 49.975 |
| 0.29953703703703705 | 49.975 |
| 0.29954861111111114 | 49.975 |
| 0.2995601851851852 | 49.975 |
| 0.2995717592592593 | 49.976 |
| 0.29958333333333337 | 49.974 |
| 0.2995949074074074 | 49.974 |
| 0.29960648148148145 | 49.976 |
| 0.29961805555555554 | 49.977 |
| 0.29962962962962963 | 49.977 |
| 0.2996412037037037 | 49.976 |
| 0.29965277777777777 | 49.975 |
| 0.29966435185185186 | 49.972 |
| 0.2996759259259259 | 49.971 |
| 0.2996875 | 49.966 |
| 0.2996990740740741 | 49.962 |
| 0.29971064814814813 | 49.958 |
| 0.2997222222222222 | 49.953 |
| 0.2997337962962963 | 49.952 |
| 0.29974537037037036 | 49.951 |
| 0.29975694444444445 | 49.952 |
| 0.29976851851851855 | 49.953 |
| 0.2997800925925926 | 49.954 |
| 0.2997916666666667 | 49.957 |
| 0.2998032407407408 | 49.959 |
| 0.2998148148148148 | 49.96 |
| 0.2998263888888889 | 49.963 |
| 0.299837962962963 | 49.965 |
| 0.29984953703703704 | 49.966 |
| 0.2998611111111111 | 49.969 |
| 0.2998726851851852 | 49.97 |
| 0.29988425925925927 | 49.97 |
| 0.2998958333333333 | 49.972 |
| 0.2999074074074074 | 49.974 |
| 0.2999189814814815 | 49.978 |
| 0.29993055555555553 | 49.98 |
| 0.29994212962962963 | 49.981 |
| 0.2999537037037037 | 49.985 |
| 0.29996527777777776 | 49.987 |
| 0.29997685185185186 | 49.988 |
| 0.29998842592592595 | 49.988 |
| 0.3 | 49.989 |
| 0.3000115740740741 | 49.989 |
| 0.3000231481481482 | 49.988 |
| 0.3000347222222222 | 49.99 |
| 0.3000462962962963 | 49.99 |
| 0.3000578703703704 | 49.988 |
| 0.30006944444444444 | 49.986 |
| 0.3000810185185185 | 49.983 |
| 0.3000925925925926 | 49.982 |
| 0.30010416666666667 | 49.98 |
| 0.3001157407407407 | 49.978 |
| 0.3001273148148148 | 49.976 |
| 0.3001388888888889 | 49.973 |
| 0.30015046296296294 | 49.972 |
| 0.30016203703703703 | 49.972 |
| 0.3001736111111111 | 49.969 |
| 0.30018518518518517 | 49.967 |
| 0.30019675925925926 | 49.967 |
| 0.30020833333333335 | 49.966 |
| 0.3002199074074074 | 49.966 |
| 0.3002314814814815 | 49.967 |
| 0.3002430555555556 | 49.967 |
| 0.3002546296296296 | 49.967 |
| 0.3002662037037037 | 49.964 |
| 0.3002777777777778 | 49.962 |
| 0.30028935185185185 | 49.963 |
| 0.30030092592592594 | 49.964 |
| 0.3003125 | 49.968 |
| 0.3003240740740741 | 49.973 |
| 0.3003356481481481 | 49.978 |
| 0.3003472222222222 | 49.982 |
| 0.3003587962962963 | 49.985 |
| 0.30037037037037034 | 49.987 |
| 0.30038194444444444 | 49.989 |
| 0.30039351851851853 | 49.986 |
| 0.30040509259259257 | 49.984 |
| 0.30041666666666667 | 49.983 |
| 0.30042824074074076 | 49.982 |
| 0.3004398148148148 | 49.982 |
| 0.3004513888888889 | 49.983 |
| 0.300462962962963 | 49.983 |
| 0.300474537037037 | 49.984 |
| 0.3004861111111111 | 49.985 |
| 0.3004976851851852 | 49.985 |
| 0.30050925925925925 | 49.988 |
| 0.30052083333333335 | 49.989 |
| 0.30053240740740744 | 49.989 |
| 0.3005439814814815 | 49.992 |
| 0.3005555555555555 | 49.994 |
| 0.3005671296296296 | 49.994 |
| 0.3005787037037037 | 49.996 |
| 0.30059027777777775 | 49.997 |
| 0.30060185185185184 | 49.996 |
| 0.30061342592592594 | 49.995 |
| 0.300625 | 49.994 |
| 0.30063657407407407 | 49.988 |
| 0.30064814814814816 | 49.978 |
| 0.3006597222222222 | 49.972 |
| 0.3006712962962963 | 49.967 |
| 0.3006828703703704 | 49.967 |
| 0.30069444444444443 | 49.969 |
| 0.3007060185185185 | 49.969 |
| 0.3007175925925926 | 49.972 |
| 0.30072916666666666 | 49.971 |
| 0.30074074074074075 | 49.969 |
| 0.30075231481481485 | 49.968 |
| 0.3007638888888889 | 49.968 |
| 0.300775462962963 | 49.965 |
| 0.300787037037037 | 49.963 |
| 0.3007986111111111 | 49.958 |
| 0.30081018518518515 | 49.952 |
| 0.30082175925925925 | 49.952 |
| 0.30083333333333334 | 49.951 |
| 0.3008449074074074 | 49.952 |
| 0.3008564814814815 | 49.952 |
| 0.30086805555555557 | 49.952 |
| 0.3008796296296296 | 49.954 |
| 0.3008912037037037 | 49.956 |
| 0.3009027777777778 | 49.959 |
| 0.30091435185185184 | 49.961 |
| 0.30092592592592593 | 49.963 |
| 0.3009375 | 49.966 |
| 0.30094907407407406 | 49.969 |
| 0.30096064814814816 | 49.973 |
| 0.30097222222222225 | 49.977 |
| 0.3009837962962963 | 49.977 |
| 0.3009953703703704 | 49.978 |
| 0.3010069444444445 | 49.978 |
| 0.3010185185185185 | 49.976 |
| 0.30103009259259256 | 49.974 |
| 0.30104166666666665 | 49.973 |
| 0.30105324074074075 | 49.969 |
| 0.3010648148148148 | 49.967 |
| 0.3010763888888889 | 49.964 |
| 0.301087962962963 | 49.96 |
| 0.301099537037037 | 49.958 |
| 0.3011111111111111 | 49.954 |
| 0.3011226851851852 | 49.955 |
| 0.30113425925925924 | 49.955 |
| 0.30114583333333333 | 49.957 |
| 0.30115740740740743 | 49.957 |
| 0.30116898148148147 | 49.955 |
| 0.30118055555555556 | 49.961 |
| 0.30119212962962966 | 49.965 |
| 0.3012037037037037 | 49.97 |
| 0.3012152777777778 | 49.976 |
| 0.3012268518518519 | 49.978 |
| 0.3012384259259259 | 49.978 |
| 0.30125 | 49.979 |
| 0.30126157407407406 | 49.979 |
| 0.30127314814814815 | 49.979 |
| 0.3012847222222222 | 49.979 |
| 0.3012962962962963 | 49.977 |
| 0.3013078703703704 | 49.974 |
| 0.3013194444444444 | 49.97 |
| 0.3013310185185185 | 49.967 |
| 0.3013425925925926 | 49.966 |
| 0.30135416666666665 | 49.963 |
| 0.30136574074074074 | 49.963 |
| 0.30137731481481483 | 49.962 |
| 0.3013888888888889 | 49.961 |
| 0.30140046296296297 | 49.961 |
| 0.30141203703703706 | 49.959 |
| 0.3014236111111111 | 49.96 |
| 0.3014351851851852 | 49.96 |
| 0.3014467592592593 | 49.962 |
| 0.30145833333333333 | 49.964 |
| 0.3014699074074074 | 49.968 |
| 0.3014814814814815 | 49.971 |
| 0.30149305555555556 | 49.975 |
| 0.3015046296296296 | 49.978 |
| 0.3015162037037037 | 49.978 |
| 0.3015277777777778 | 49.978 |
| 0.3015393518518518 | 49.981 |
| 0.3015509259259259 | 49.98 |
| 0.3015625 | 49.979 |
| 0.30157407407407405 | 49.98 |
| 0.30158564814814814 | 49.983 |
| 0.30159722222222224 | 49.986 |
| 0.3016087962962963 | 49.987 |
| 0.30162037037037037 | 49.99 |
| 0.30163194444444447 | 49.991 |
| 0.3016435185185185 | 49.991 |
| 0.3016550925925926 | 49.991 |
| 0.3016666666666667 | 49.991 |
| 0.30167824074074073 | 49.99 |
| 0.3016898148148148 | 49.989 |
| 0.3017013888888889 | 49.987 |
| 0.30171296296296296 | 49.987 |
| 0.301724537037037 | 49.985 |
| 0.3017361111111111 | 49.984 |
| 0.3017476851851852 | 49.984 |
| 0.3017592592592592 | 49.984 |
| 0.3017708333333333 | 49.984 |
| 0.3017824074074074 | 49.981 |
| 0.30179398148148145 | 49.976 |
| 0.30180555555555555 | 49.977 |
| 0.30181712962962964 | 49.98 |
| 0.3018287037037037 | 49.981 |
| 0.3018402777777778 | 49.981 |
| 0.30185185185185187 | 49.98 |
| 0.3018634259259259 | 49.979 |
| 0.301875 | 49.978 |
| 0.3018865740740741 | 49.975 |
| 0.30189814814814814 | 49.97 |
| 0.30190972222222223 | 49.965 |
| 0.3019212962962963 | 49.961 |
| 0.30193287037037037 | 49.958 |
| 0.30194444444444446 | 49.958 |
| 0.30195601851851855 | 49.959 |
| 0.3019675925925926 | 49.961 |
| 0.30197916666666663 | 49.962 |
| 0.3019907407407407 | 49.966 |
| 0.3020023148148148 | 49.968 |
| 0.30201388888888886 | 49.969 |
| 0.30202546296296295 | 49.971 |
| 0.30203703703703705 | 49.972 |
| 0.3020486111111111 | 49.972 |
| 0.3020601851851852 | 49.976 |
| 0.3020717592592593 | 49.979 |
| 0.3020833333333333 | 49.985 |
| 0.3020949074074074 | 49.989 |
| 0.3021064814814815 | 49.988 |
| 0.30211805555555554 | 49.987 |
| 0.30212962962962964 | 49.985 |
| 0.30214120370370373 | 49.984 |
| 0.30215277777777777 | 49.984 |
| 0.30216435185185186 | 49.983 |
| 0.30217592592592596 | 49.982 |
| 0.3021875 | 49.979 |
| 0.3021990740740741 | 49.974 |
| 0.30221064814814813 | 49.969 |
| 0.3022222222222222 | 49.964 |
| 0.30223379629629626 | 49.961 |
| 0.30224537037037036 | 49.958 |
| 0.30225694444444445 | 49.955 |
| 0.3022685185185185 | 49.952 |
| 0.3022800925925926 | 49.951 |
| 0.3022916666666667 | 49.95 |
| 0.3023032407407407 | 49.951 |
| 0.3023148148148148 | 49.953 |
| 0.3023263888888889 | 49.955 |
| 0.30233796296296295 | 49.955 |
| 0.30234953703703704 | 49.956 |
| 0.30236111111111114 | 49.957 |
| 0.3023726851851852 | 49.955 |
| 0.30238425925925927 | 49.953 |
| 0.30239583333333336 | 49.951 |
| 0.3024074074074074 | 49.951 |
| 0.3024189814814815 | 49.95 |
| 0.3024305555555556 | 49.953 |
| 0.30244212962962963 | 49.954 |
| 0.30245370370370367 | 49.954 |
| 0.30246527777777776 | 49.951 |
| 0.30247685185185186 | 49.947 |
| 0.3024884259259259 | 49.945 |
| 0.3025 | 49.943 |
| 0.3025115740740741 | 49.943 |
| 0.3025231481481481 | 49.946 |
| 0.3025347222222222 | 49.949 |
| 0.3025462962962963 | 49.951 |
| 0.30255787037037035 | 49.951 |
| 0.30256944444444445 | 49.954 |
| 0.30258101851851854 | 49.957 |
| 0.3025925925925926 | 49.962 |
| 0.3026041666666667 | 49.965 |
| 0.30261574074074077 | 49.968 |
| 0.3026273148148148 | 49.97 |
| 0.3026388888888889 | 49.973 |
| 0.302650462962963 | 49.975 |
| 0.30266203703703703 | 49.973 |
| 0.3026736111111111 | 49.971 |
| 0.30268518518518517 | 49.968 |
| 0.30269675925925926 | 49.966 |
| 0.3027083333333333 | 49.963 |
| 0.3027199074074074 | 49.961 |
| 0.3027314814814815 | 49.958 |
| 0.30274305555555553 | 49.955 |
| 0.3027546296296296 | 49.955 |
| 0.3027662037037037 | 49.954 |
| 0.30277777777777776 | 49.955 |
| 0.30278935185185185 | 49.954 |
| 0.30280092592592595 | 49.955 |
| 0.3028125 | 49.953 |
| 0.3028240740740741 | 49.952 |
| 0.3028356481481482 | 49.952 |
| 0.3028472222222222 | 49.95 |
| 0.3028587962962963 | 49.95 |
| 0.3028703703703704 | 49.95 |
| 0.30288194444444444 | 49.954 |
| 0.30289351851851853 | 49.954 |
| 0.30290509259259263 | 49.955 |
| 0.30291666666666667 | 49.957 |
| 0.3029282407407407 | 49.96 |
| 0.3029398148148148 | 49.962 |
| 0.3029513888888889 | 49.963 |
| 0.30296296296296293 | 49.966 |
| 0.30297453703703703 | 49.966 |
| 0.3029861111111111 | 49.966 |
| 0.30299768518518516 | 49.965 |
| 0.30300925925925926 | 49.966 |
| 0.30302083333333335 | 49.966 |
| 0.3030324074074074 | 49.967 |
| 0.3030439814814815 | 49.967 |
| 0.3030555555555556 | 49.968 |
| 0.3030671296296296 | 49.967 |
| 0.3030787037037037 | 49.964 |
| 0.3030902777777778 | 49.96 |
| 0.30310185185185184 | 49.96 |
| 0.30311342592592594 | 49.96 |
| 0.30312500000000003 | 49.96 |
| 0.30313657407407407 | 49.96 |
| 0.30314814814814817 | 49.96 |
| 0.3031597222222222 | 49.959 |
| 0.3031712962962963 | 49.957 |
| 0.30318287037037034 | 49.955 |
| 0.30319444444444443 | 49.951 |
| 0.3032060185185185 | 49.947 |
| 0.30321759259259257 | 49.942 |
| 0.30322916666666666 | 49.938 |
| 0.30324074074074076 | 49.933 |
| 0.3032523148148148 | 49.929 |
| 0.3032638888888889 | 49.928 |
| 0.303275462962963 | 49.929 |
| 0.303287037037037 | 49.929 |
| 0.3032986111111111 | 49.927 |
| 0.3033101851851852 | 49.929 |
| 0.30332175925925925 | 49.928 |
| 0.30333333333333334 | 49.929 |
| 0.30334490740740744 | 49.935 |
| 0.3033564814814815 | 49.939 |
| 0.30336805555555557 | 49.942 |
| 0.30337962962962967 | 49.945 |
| 0.3033912037037037 | 49.947 |
| 0.30340277777777774 | 49.947 |
| 0.30341435185185184 | 49.944 |
| 0.30342592592592593 | 49.94 |
| 0.30343749999999997 | 49.937 |
| 0.30344907407407407 | 49.935 |
| 0.30346064814814816 | 49.932 |
| 0.3034722222222222 | 49.931 |
| 0.3034837962962963 | 49.931 |
| 0.3034953703703704 | 49.931 |
| 0.3035069444444444 | 49.929 |
| 0.3035185185185185 | 49.928 |
| 0.3035300925925926 | 49.927 |
| 0.30354166666666665 | 49.925 |
| 0.30355324074074075 | 49.924 |
| 0.30356481481481484 | 49.924 |
| 0.3035763888888889 | 49.921 |
| 0.303587962962963 | 49.92 |
| 0.30359953703703707 | 49.919 |
| 0.3036111111111111 | 49.917 |
| 0.30362268518518515 | 49.916 |
| 0.30363425925925924 | 49.915 |
| 0.30364583333333334 | 49.916 |
| 0.3036574074074074 | 49.92 |
| 0.30366898148148147 | 49.924 |
| 0.30368055555555556 | 49.926 |
| 0.3036921296296296 | 49.93 |
| 0.3037037037037037 | 49.934 |
| 0.3037152777777778 | 49.935 |
| 0.30372685185185183 | 49.937 |
| 0.3037384259259259 | 49.942 |
| 0.30375 | 49.942 |
| 0.30376157407407406 | 49.943 |
| 0.30377314814814815 | 49.943 |
| 0.30378472222222225 | 49.943 |
| 0.3037962962962963 | 49.941 |
| 0.3038078703703704 | 49.941 |
| 0.3038194444444445 | 49.943 |
| 0.3038310185185185 | 49.943 |
| 0.3038425925925926 | 49.945 |
| 0.3038541666666667 | 49.948 |
| 0.30386574074074074 | 49.95 |
| 0.3038773148148148 | 49.951 |
| 0.3038888888888889 | 49.955 |
| 0.30390046296296297 | 49.956 |
| 0.303912037037037 | 49.956 |
| 0.3039236111111111 | 49.954 |
| 0.3039351851851852 | 49.953 |
| 0.30394675925925924 | 49.949 |
| 0.30395833333333333 | 49.945 |
| 0.3039699074074074 | 49.942 |
| 0.30398148148148146 | 49.941 |
| 0.30399305555555556 | 49.938 |
| 0.30400462962962965 | 49.937 |
| 0.3040162037037037 | 49.939 |
| 0.3040277777777778 | 49.938 |
| 0.3040393518518519 | 49.938 |
| 0.3040509259259259 | 49.94 |
| 0.3040625 | 49.944 |
| 0.3040740740740741 | 49.946 |
| 0.30408564814814815 | 49.95 |
| 0.3040972222222222 | 49.954 |
| 0.3041087962962963 | 49.957 |
| 0.3041203703703704 | 49.957 |
| 0.3041319444444444 | 49.96 |
| 0.3041435185185185 | 49.962 |
| 0.3041550925925926 | 49.963 |
| 0.30416666666666664 | 49.964 |
| 0.30417824074074074 | 49.965 |
| 0.30418981481481483 | 49.965 |
| 0.30420138888888887 | 49.963 |
| 0.30421296296296296 | 49.962 |
| 0.30422453703703706 | 49.961 |
| 0.3042361111111111 | 49.961 |
| 0.3042476851851852 | 49.962 |
| 0.3042592592592593 | 49.962 |
| 0.3042708333333333 | 49.961 |
| 0.3042824074074074 | 49.961 |
| 0.3042939814814815 | 49.959 |
| 0.30430555555555555 | 49.957 |
| 0.30431712962962965 | 49.955 |
| 0.30432870370370374 | 49.954 |
| 0.3043402777777778 | 49.953 |
| 0.3043518518518518 | 49.953 |
| 0.3043634259259259 | 49.951 |
| 0.304375 | 49.95 |
| 0.30438657407407405 | 49.949 |
| 0.30439814814814814 | 49.949 |
| 0.30440972222222223 | 49.947 |
| 0.3044212962962963 | 49.946 |
| 0.30443287037037037 | 49.946 |
| 0.30444444444444446 | 49.944 |
| 0.3044560185185185 | 49.944 |
| 0.3044675925925926 | 49.946 |
| 0.3044791666666667 | 49.948 |
| 0.30449074074074073 | 49.949 |
| 0.3045023148148148 | 49.95 |
| 0.3045138888888889 | 49.953 |
| 0.30452546296296296 | 49.954 |
| 0.30453703703703705 | 49.954 |
| 0.30454861111111114 | 49.951 |
| 0.3045601851851852 | 49.95 |
| 0.3045717592592592 | 49.948 |
| 0.3045833333333333 | 49.947 |
| 0.3045949074074074 | 49.943 |
| 0.30460648148148145 | 49.941 |
| 0.30461805555555554 | 49.938 |
| 0.30462962962962964 | 49.935 |
| 0.3046412037037037 | 49.932 |
| 0.3046527777777778 | 49.931 |
| 0.30466435185185187 | 49.931 |
| 0.3046759259259259 | 49.93 |
| 0.3046875 | 49.932 |
| 0.3046990740740741 | 49.937 |
| 0.30471064814814813 | 49.939 |
| 0.3047222222222222 | 49.94 |
| 0.3047337962962963 | 49.943 |
| 0.30474537037037036 | 49.945 |
| 0.30475694444444446 | 49.943 |
| 0.30476851851851855 | 49.941 |
| 0.3047800925925926 | 49.937 |
| 0.3047916666666667 | 49.934 |
| 0.3048032407407408 | 49.928 |
| 0.3048148148148148 | 49.926 |
| 0.30482638888888886 | 49.923 |
| 0.30483796296296295 | 49.923 |
| 0.30484953703703704 | 49.923 |
| 0.3048611111111111 | 49.924 |
| 0.3048726851851852 | 49.923 |
| 0.30488425925925927 | 49.923 |
| 0.3048958333333333 | 49.923 |
| 0.3049074074074074 | 49.924 |
| 0.3049189814814815 | 49.924 |
| 0.30493055555555554 | 49.925 |
| 0.30494212962962963 | 49.925 |
| 0.3049537037037037 | 49.924 |
| 0.30496527777777777 | 49.923 |
| 0.30497685185185186 | 49.923 |
| 0.30498842592592595 | 49.923 |
| 0.305 | 49.924 |
| 0.3050115740740741 | 49.924 |
| 0.3050231481481482 | 49.928 |
| 0.3050347222222222 | 49.928 |
| 0.30504629629629626 | 49.931 |
| 0.30505787037037035 | 49.93 |
| 0.30506944444444445 | 49.929 |
| 0.3050810185185185 | 49.93 |
| 0.3050925925925926 | 49.933 |
| 0.3051041666666667 | 49.934 |
| 0.3051157407407407 | 49.938 |
| 0.3051273148148148 | 49.936 |
| 0.3051388888888889 | 49.933 |
| 0.30515046296296294 | 49.932 |
| 0.30516203703703704 | 49.929 |
| 0.30517361111111113 | 49.928 |
| 0.30518518518518517 | 49.929 |
| 0.30519675925925926 | 49.93 |
| 0.30520833333333336 | 49.931 |
| 0.3052199074074074 | 49.93 |
| 0.3052314814814815 | 49.929 |
| 0.3052430555555556 | 49.931 |
| 0.3052546296296296 | 49.93 |
| 0.3052662037037037 | 49.931 |
| 0.3052777777777778 | 49.935 |
| 0.30528935185185185 | 49.937 |
| 0.3053009259259259 | 49.941 |
| 0.3053125 | 49.942 |
| 0.3053240740740741 | 49.944 |
| 0.3053356481481481 | 49.947 |
| 0.3053472222222222 | 49.949 |
| 0.3053587962962963 | 49.948 |
| 0.30537037037037035 | 49.949 |
| 0.30538194444444444 | 49.951 |
| 0.30539351851851854 | 49.952 |
| 0.3054050925925926 | 49.957 |
| 0.30541666666666667 | 49.96 |
| 0.30542824074074076 | 49.961 |
| 0.3054398148148148 | 49.961 |
| 0.3054513888888889 | 49.962 |
| 0.305462962962963 | 49.961 |
| 0.30547453703703703 | 49.962 |
| 0.3054861111111111 | 49.962 |
| 0.3054976851851852 | 49.964 |
| 0.30550925925925926 | 49.963 |
| 0.3055208333333333 | 49.963 |
| 0.3055324074074074 | 49.963 |
| 0.3055439814814815 | 49.967 |
| 0.3055555555555555 | 49.966 |
| 0.3055671296296296 | 49.965 |
| 0.3055787037037037 | 49.964 |
| 0.30559027777777775 | 49.963 |
| 0.30560185185185185 | 49.963 |
| 0.30561342592592594 | 49.963 |
| 0.305625 | 49.962 |
| 0.3056365740740741 | 49.961 |
| 0.30564814814814817 | 49.961 |
| 0.3056597222222222 | 49.963 |
| 0.3056712962962963 | 49.964 |
| 0.3056828703703704 | 49.967 |
| 0.30569444444444444 | 49.973 |
| 0.30570601851851853 | 49.978 |
| 0.3057175925925926 | 49.982 |
| 0.30572916666666666 | 49.984 |
| 0.30574074074074076 | 49.985 |
| 0.30575231481481485 | 49.983 |
| 0.3057638888888889 | 49.982 |
| 0.30577546296296293 | 49.982 |
| 0.305787037037037 | 49.985 |
| 0.3057986111111111 | 49.979 |
| 0.30581018518518516 | 49.98 |
| 0.30582175925925925 | 49.976 |
| 0.30583333333333335 | 49.976 |
| 0.3058449074074074 | 49.977 |
| 0.3058564814814815 | 49.974 |
| 0.3058680555555556 | 49.973 |
| 0.3058796296296296 | 49.972 |
| 0.3058912037037037 | 49.97 |
| 0.3059027777777778 | 49.971 |
| 0.30591435185185184 | 49.971 |
| 0.30592592592592593 | 49.971 |
| 0.30593750000000003 | 49.971 |
| 0.30594907407407407 | 49.971 |
| 0.30596064814814816 | 49.971 |
| 0.30597222222222226 | 49.974 |
| 0.3059837962962963 | 49.976 |
| 0.30599537037037033 | 49.978 |
| 0.30600694444444443 | 49.978 |
| 0.3060185185185185 | 49.977 |
| 0.30603009259259256 | 49.975 |
| 0.30604166666666666 | 49.973 |
| 0.30605324074074075 | 49.969 |
| 0.3060648148148148 | 49.967 |
| 0.3060763888888889 | 49.962 |
| 0.306087962962963 | 49.959 |
| 0.306099537037037 | 49.958 |
| 0.3061111111111111 | 49.957 |
| 0.3061226851851852 | 49.958 |
| 0.30613425925925924 | 49.958 |
| 0.30614583333333334 | 49.957 |
| 0.30615740740740743 | 49.959 |
| 0.3061689814814815 | 49.961 |
| 0.30618055555555557 | 49.964 |
| 0.30619212962962966 | 49.966 |
| 0.3062037037037037 | 49.966 |
| 0.3062152777777778 | 49.967 |
| 0.30622685185185183 | 49.964 |
| 0.30623842592592593 | 49.964 |
| 0.30624999999999997 | 49.964 |
| 0.30626157407407406 | 49.962 |
| 0.30627314814814816 | 49.964 |
| 0.3062847222222222 | 49.968 |
| 0.3062962962962963 | 49.972 |
| 0.3063078703703704 | 49.978 |
| 0.3063194444444444 | 49.98 |
| 0.3063310185185185 | 49.98 |
| 0.3063425925925926 | 49.982 |
| 0.30635416666666665 | 49.98 |
| 0.30636574074074074 | 49.98 |
| 0.30637731481481484 | 49.98 |
| 0.3063888888888889 | 49.978 |
| 0.30640046296296297 | 49.978 |
| 0.30641203703703707 | 49.975 |
| 0.3064236111111111 | 49.975 |
| 0.3064351851851852 | 49.974 |
| 0.3064467592592593 | 49.973 |
| 0.30645833333333333 | 49.972 |
| 0.30646990740740737 | 49.971 |
| 0.30648148148148147 | 49.973 |
| 0.30649305555555556 | 49.977 |
| 0.3065046296296296 | 49.981 |
| 0.3065162037037037 | 49.984 |
| 0.3065277777777778 | 49.987 |
| 0.3065393518518518 | 49.989 |
| 0.3065509259259259 | 49.99 |
| 0.3065625 | 49.993 |
| 0.30657407407407405 | 49.996 |
| 0.30658564814814815 | 50.001 |
| 0.30659722222222224 | 50.005 |
| 0.3066087962962963 | 50.008 |
| 0.3066203703703704 | 50.009 |
| 0.30663194444444447 | 50.01 |
| 0.3066435185185185 | 50.014 |
| 0.3066550925925926 | 50.015 |
| 0.3066666666666667 | 50.019 |
| 0.30667824074074074 | 50.021 |
| 0.30668981481481483 | 50.025 |
| 0.30670138888888887 | 50.023 |
| 0.30671296296296297 | 50.025 |
| 0.306724537037037 | 50.026 |
| 0.3067361111111111 | 50.026 |
| 0.3067476851851852 | 50.027 |
| 0.30675925925925923 | 50.025 |
| 0.3067708333333333 | 50.024 |
| 0.3067824074074074 | 50.021 |
| 0.30679398148148146 | 50.02 |
| 0.30680555555555555 | 50.017 |
| 0.30681712962962965 | 50.016 |
| 0.3068287037037037 | 50.015 |
| 0.3068402777777778 | 50.013 |
| 0.3068518518518519 | 50.013 |
| 0.3068634259259259 | 50.009 |
| 0.306875 | 50.009 |
| 0.3068865740740741 | 50.006 |
| 0.30689814814814814 | 50.005 |
| 0.30690972222222224 | 50.005 |
| 0.30692129629629633 | 50.004 |
| 0.30693287037037037 | 50.004 |